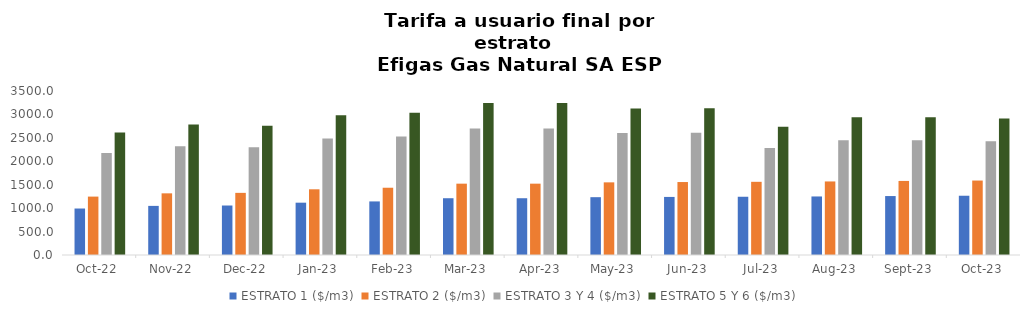
| Category | ESTRATO 1 ($/m3) | ESTRATO 2 ($/m3) | ESTRATO 3 Y 4 ($/m3) | ESTRATO 5 Y 6 ($/m3) |
|---|---|---|---|---|
| 2022-10-01 | 992.06 | 1246.38 | 2176.65 | 2611.98 |
| 2022-11-01 | 1048.08 | 1315.96 | 2318.8 | 2782.56 |
| 2022-12-01 | 1056.14 | 1326.08 | 2297.18 | 2756.616 |
| 2023-01-01 | 1116.6 | 1402.33 | 2485 | 2982 |
| 2023-02-01 | 1143.48 | 1435.53 | 2531 | 3037.2 |
| 2023-03-01 | 1211.66 | 1522.37 | 2701.57 | 3241.884 |
| 2023-04-01 | 1211.66 | 1522.37 | 2701.57 | 3241.884 |
| 2023-05-01 | 1233.96 | 1550.39 | 2603.83 | 3124.596 |
| 2023-06-01 | 1239.35 | 1557.16 | 2610.15 | 3132.18 |
| 2023-07-01 | 1243.07 | 1561.83 | 2281.753 | 2738.104 |
| 2023-08-01 | 1249.3 | 1569.65 | 2451.116 | 2941.34 |
| 2023-09-01 | 1258.03 | 1580.63 | 2447.703 | 2937.244 |
| 2023-10-01 | 1264.72 | 1589.03 | 2427.174 | 2912.609 |